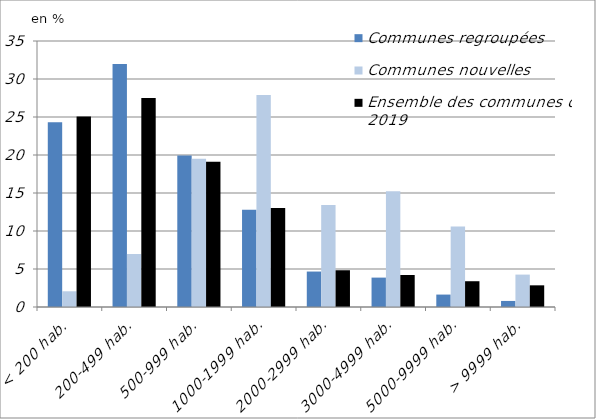
| Category | Communes regroupées | Communes nouvelles | Ensemble des communes de 2019 |
|---|---|---|---|
| < 200 hab. | 24.322 | 2.067 | 25.07 |
| 200-499 hab. | 31.978 | 6.977 | 27.498 |
| 500-999 hab. | 19.936 | 19.509 | 19.108 |
| 1000-1999 hab. | 12.799 | 27.907 | 13.037 |
| 2000-2999 hab. | 4.665 | 13.437 | 4.836 |
| 3000-4999 hab. | 3.868 | 15.245 | 4.209 |
| 5000-9999 hab. | 1.635 | 10.594 | 3.391 |
| > 9999 hab. | 0.797 | 4.264 | 2.851 |